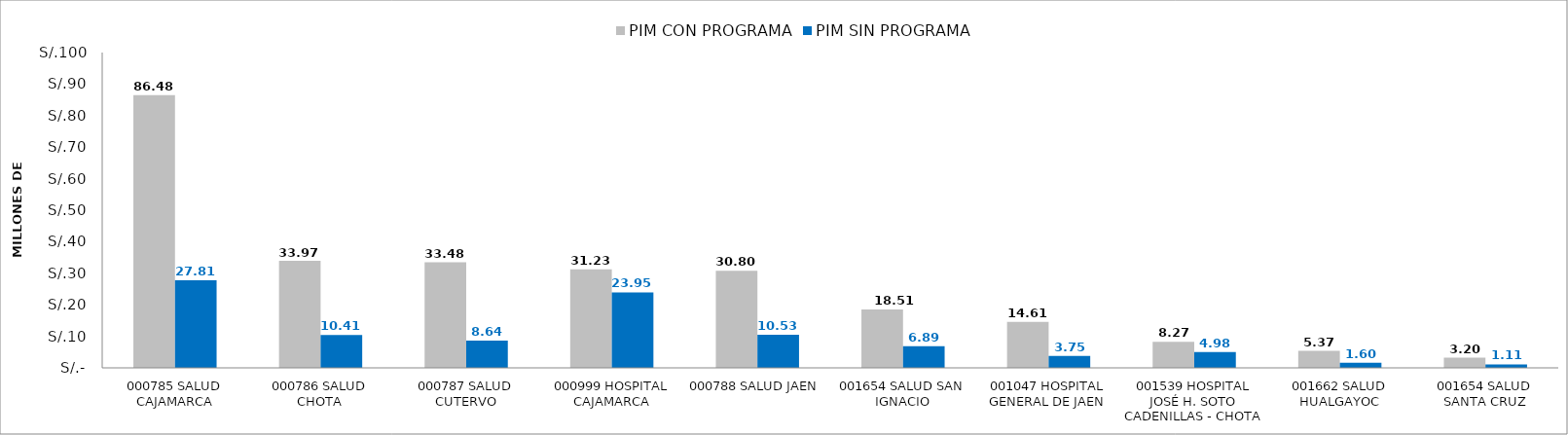
| Category | PIM CON PROGRAMA | PIM SIN PROGRAMA |
|---|---|---|
| 000785 SALUD CAJAMARCA | 86.48 | 27.807 |
| 000786 SALUD CHOTA | 33.969 | 10.414 |
| 000787 SALUD CUTERVO | 33.475 | 8.644 |
| 000999 HOSPITAL CAJAMARCA | 31.229 | 23.95 |
| 000788 SALUD JAEN | 30.804 | 10.528 |
| 001654 SALUD SAN IGNACIO | 18.512 | 6.886 |
| 001047 HOSPITAL GENERAL DE JAEN | 14.608 | 3.754 |
| 001539 HOSPITAL JOSÉ H. SOTO CADENILLAS - CHOTA | 8.271 | 4.98 |
| 001662 SALUD HUALGAYOC | 5.368 | 1.604 |
| 001654 SALUD SANTA CRUZ | 3.204 | 1.105 |